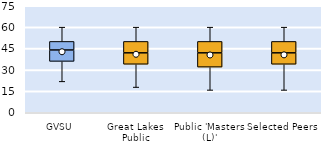
| Category | 25th | 50th | 75th |
|---|---|---|---|
| GVSU | 36 | 8 | 6 |
| Great Lakes Public | 34 | 8 | 8 |
| Public 'Masters (L)' | 32 | 10 | 8 |
| Selected Peers | 34 | 8 | 8 |